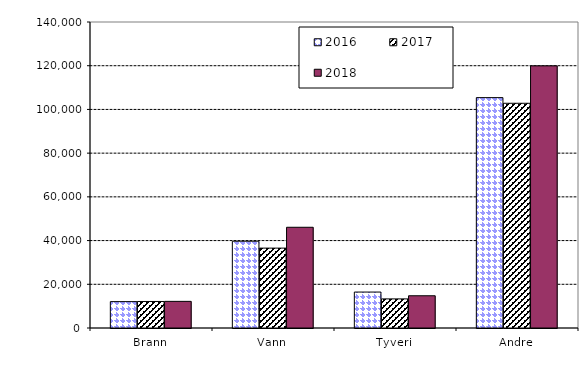
| Category | 2016 | 2017 | 2018 |
|---|---|---|---|
| Brann | 12067.935 | 12131.619 | 12186.599 |
| Vann | 39707.453 | 36546.509 | 46084.437 |
| Tyveri | 16448.436 | 13316.301 | 14752.684 |
| Andre | 105404.836 | 102813.999 | 119937.321 |